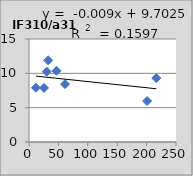
| Category | IF310/a310 |
|---|---|
| 25.5 | 7.87 |
| 61.3 | 8.43 |
| 11.7 | 7.91 |
| 216.5 | 9.3 |
| 46.8 | 10.37 |
| 32.5 | 11.9 |
| 200.8 | 5.97 |
| 30.1 | 10.24 |